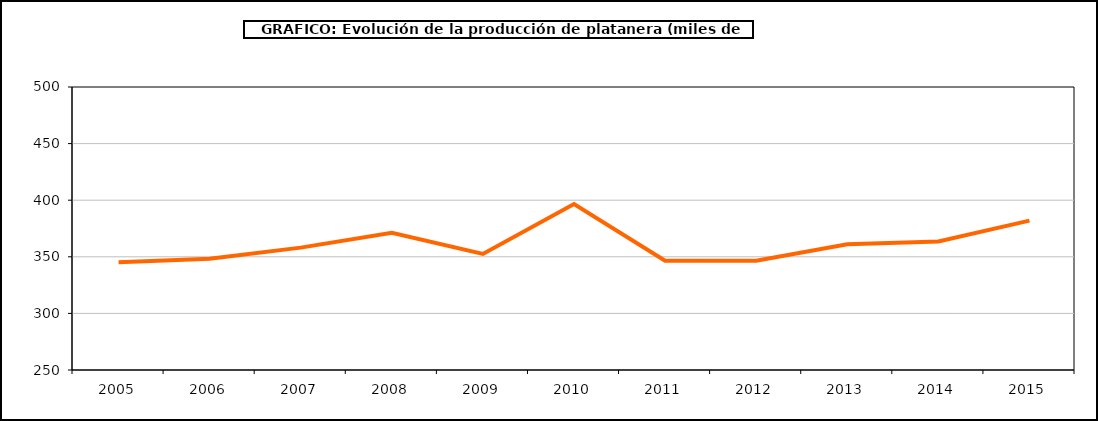
| Category | producción platanera |
|---|---|
| 2005.0 | 345.156 |
| 2006.0 | 348.368 |
| 2007.0 | 358.117 |
| 2008.0 | 371.228 |
| 2009.0 | 352.522 |
| 2010.0 | 396.589 |
| 2011.0 | 346.509 |
| 2012.0 | 346.509 |
| 2013.0 | 360.987 |
| 2014.0 | 363.552 |
| 2015.0 | 381.983 |